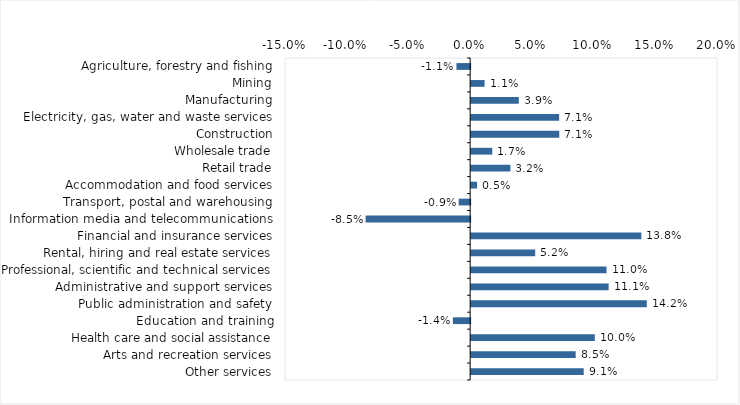
| Category | This week |
|---|---|
| Agriculture, forestry and fishing | -0.011 |
| Mining | 0.011 |
| Manufacturing | 0.039 |
| Electricity, gas, water and waste services | 0.071 |
| Construction | 0.071 |
| Wholesale trade | 0.017 |
| Retail trade | 0.032 |
| Accommodation and food services | 0.005 |
| Transport, postal and warehousing | -0.009 |
| Information media and telecommunications | -0.085 |
| Financial and insurance services | 0.138 |
| Rental, hiring and real estate services | 0.052 |
| Professional, scientific and technical services | 0.11 |
| Administrative and support services | 0.111 |
| Public administration and safety | 0.142 |
| Education and training | -0.014 |
| Health care and social assistance | 0.1 |
| Arts and recreation services | 0.085 |
| Other services | 0.091 |